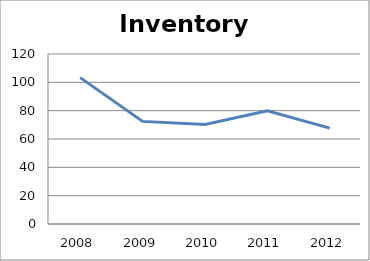
| Category | Series 0 |
|---|---|
| 2008.0 | 103.33 |
| 2009.0 | 72.43 |
| 2010.0 | 70.25 |
| 2011.0 | 79.93 |
| 2012.0 | 67.65 |